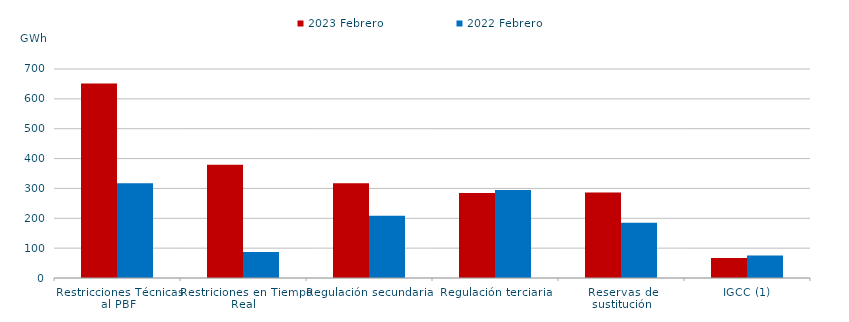
| Category | 2023 Febrero | 2022 Febrero |
|---|---|---|
| Restricciones Técnicas al PBF | 651.728 | 317.614 |
| Restriciones en Tiempo Real | 379.568 | 87.351 |
| Regulación secundaria | 317.08 | 208.52 |
| Regulación terciaria | 284.823 | 294.91 |
| Reservas de sustitución | 286.042 | 184.738 |
| IGCC (1) | 66.764 | 75.739 |